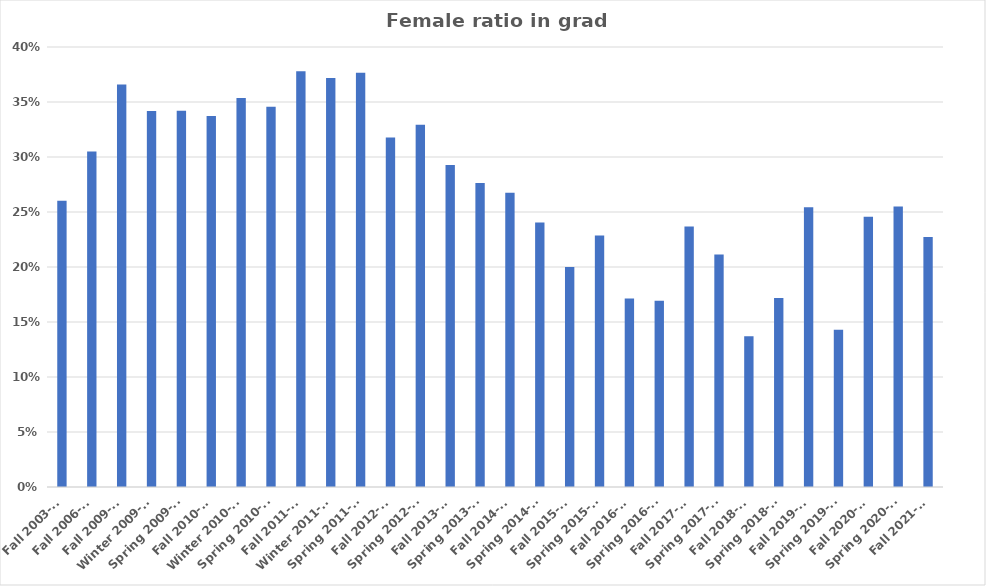
| Category | Female ratio in grad class |
|---|---|
| Fall 2003-04 | 0.26 |
| Fall 2006-07 | 0.305 |
| Fall 2009-10 | 0.366 |
| Winter 2009-10 | 0.342 |
| Spring 2009-10 | 0.342 |
| Fall 2010-11 | 0.337 |
| Winter 2010-11 | 0.354 |
| Spring 2010-11 | 0.346 |
| Fall 2011-12 | 0.378 |
| Winter 2011-12 | 0.372 |
| Spring 2011-12 | 0.377 |
| Fall 2012-13 | 0.318 |
| Spring 2012-13 | 0.329 |
| Fall 2013-14 | 0.293 |
| Spring 2013-14 | 0.276 |
| Fall 2014-15 | 0.267 |
| Spring 2014-15 | 0.241 |
| Fall 2015-16 | 0.2 |
| Spring 2015-16 | 0.229 |
| Fall 2016-17 | 0.171 |
| Spring 2016-17 | 0.169 |
| Fall 2017-18 | 0.237 |
| Spring 2017-18 | 0.211 |
| Fall 2018-19 | 0.137 |
| Spring 2018-19 | 0.172 |
| Fall 2019-20 | 0.254 |
| Spring 2019-20 | 0.143 |
| Fall 2020-21 | 0.246 |
| Spring 2020-21 | 0.255 |
| Fall 2021-22 | 0.227 |